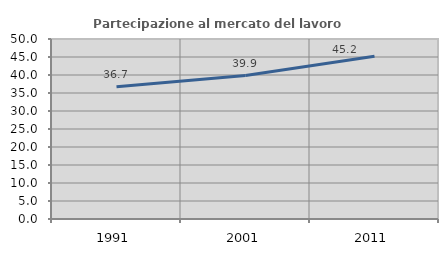
| Category | Partecipazione al mercato del lavoro  femminile |
|---|---|
| 1991.0 | 36.731 |
| 2001.0 | 39.853 |
| 2011.0 | 45.183 |